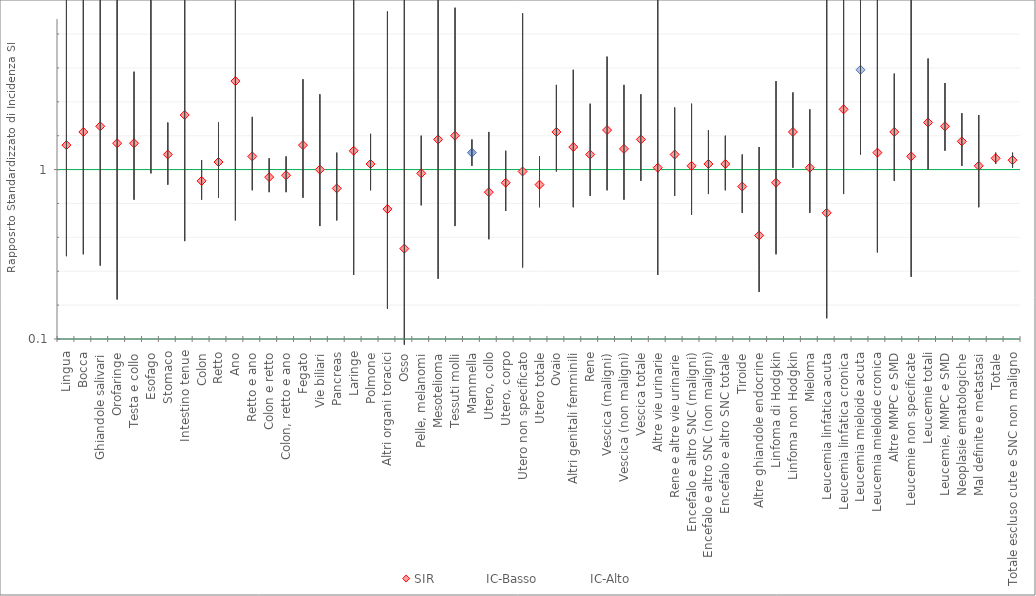
| Category | SIR | IC-Basso | IC-Alto |
|---|---|---|---|
| Lingua | 1.13 | 0.54 | 2.08 |
| Bocca | 1.2 | 0.55 | 2.27 |
| Ghiandole salivari | 1.23 | 0.49 | 2.53 |
| Orofaringe | 1.14 | 0.31 | 2.92 |
| Testa e collo | 1.14 | 0.84 | 1.52 |
| Esofago | 1.89 | 0.98 | 3.3 |
| Stomaco | 1.08 | 0.92 | 1.25 |
| Intestino tenue | 1.29 | 0.62 | 2.38 |
| Colon | 0.94 | 0.84 | 1.05 |
| Retto | 1.04 | 0.85 | 1.25 |
| Ano | 1.47 | 0.73 | 2.63 |
| Retto e ano | 1.07 | 0.89 | 1.28 |
| Colon e retto | 0.96 | 0.88 | 1.06 |
| Colon, retto e ano | 0.97 | 0.88 | 1.07 |
| Fegato | 1.13 | 0.85 | 1.48 |
| Vie biliari | 1 | 0.7 | 1.4 |
| Pancreas | 0.9 | 0.73 | 1.09 |
| Laringe | 1.1 | 0.44 | 2.27 |
| Polmone | 1.03 | 0.89 | 1.19 |
| Altri organi toracici | 0.79 | 0.26 | 1.84 |
| Osso | 0.58 | 0.07 | 2.1 |
| Pelle, melanomi | 0.98 | 0.81 | 1.18 |
| Mesotelioma | 1.16 | 0.42 | 2.52 |
| Tessuti molli | 1.18 | 0.7 | 1.86 |
| Mammella | 1.09 | 1.02 | 1.16 |
| Utero, collo | 0.88 | 0.63 | 1.2 |
| Utero, corpo | 0.93 | 0.78 | 1.1 |
| Utero non specificato | 0.99 | 0.48 | 1.83 |
| Utero totale | 0.92 | 0.8 | 1.07 |
| Ovaio | 1.2 | 0.99 | 1.45 |
| Altri genitali femminili | 1.12 | 0.8 | 1.53 |
| Rene | 1.08 | 0.86 | 1.35 |
| Vescica (maligni) | 1.21 | 0.89 | 1.6 |
| Vescica (non maligni) | 1.11 | 0.84 | 1.45 |
| Vescica totale | 1.16 | 0.94 | 1.4 |
| Altre vie urinarie | 1.01 | 0.44 | 2 |
| Rene e altre vie urinarie | 1.08 | 0.86 | 1.33 |
| Encefalo e altro SNC (maligni) | 1.02 | 0.76 | 1.35 |
| Encefalo e altro SNC (non maligni) | 1.03 | 0.87 | 1.21 |
| Encefalo e altro SNC totale | 1.03 | 0.89 | 1.18 |
| Tiroide | 0.91 | 0.77 | 1.08 |
| Altre ghiandole endocrine | 0.65 | 0.35 | 1.12 |
| Linfoma di Hodgkin | 0.93 | 0.55 | 1.47 |
| Linfoma non Hodgkin | 1.2 | 1.01 | 1.41 |
| Mieloma | 1.01 | 0.77 | 1.32 |
| Leucemia linfatica acuta | 0.77 | 0.21 | 1.98 |
| Leucemia linfatica cronica | 1.32 | 0.87 | 1.93 |
| Leucemia mieloide acuta | 1.53 | 1.08 | 2.11 |
| Leucemia mieloide cronica | 1.09 | 0.56 | 1.91 |
| Altre MMPC e SMD | 1.2 | 0.94 | 1.51 |
| Leucemie non specificate | 1.07 | 0.43 | 2.2 |
| Leucemie totali | 1.25 | 1 | 1.59 |
| Leucemie, MMPC e SMD | 1.23 | 1.1 | 1.46 |
| Neoplasie ematologiche | 1.15 | 1.02 | 1.3 |
| Mal definite e metastasi | 1.02 | 0.8 | 1.29 |
| Totale | 1.06 | 1.03 | 1.09 |
| Totale escluso cute e SNC non maligno | 1.05 | 1.01 | 1.09 |